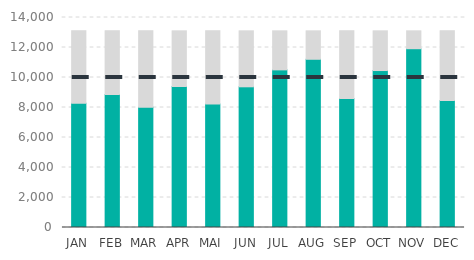
| Category | Actual | Max |
|---|---|---|
| JAN | 8276 | 4836 |
| FEB | 8863 | 4249 |
| MAR | 8021 | 5091 |
| APR | 9400 | 3712 |
| MAI | 8234 | 4878 |
| JUN | 9380 | 3732 |
| JUL | 10509 | 2603 |
| AUG | 11215 | 1897 |
| SEP | 8599 | 4513 |
| OCT | 10464 | 2648 |
| NOV | 11920 | 1192 |
| DEC | 8470 | 4642 |